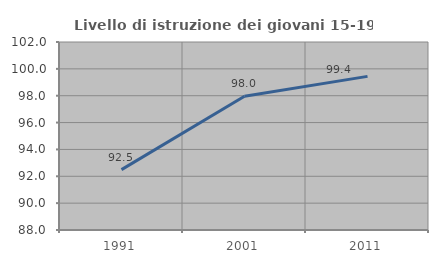
| Category | Livello di istruzione dei giovani 15-19 anni |
|---|---|
| 1991.0 | 92.499 |
| 2001.0 | 97.958 |
| 2011.0 | 99.44 |